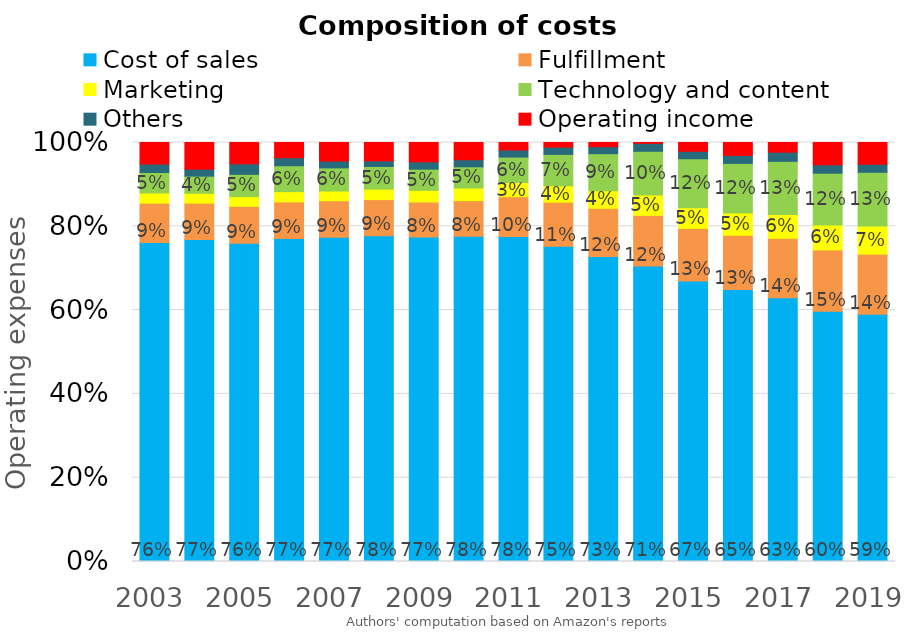
| Category | Cost of sales | Fulfillment | Marketing | Technology and content | Others | Operating income |
|---|---|---|---|---|---|---|
| 2003.0 | 0.761 | 0.094 | 0.024 | 0.049 | 0.02 | 0.051 |
| 2004.0 | 0.769 | 0.087 | 0.023 | 0.041 | 0.017 | 0.064 |
| 2005.0 | 0.76 | 0.088 | 0.023 | 0.053 | 0.025 | 0.051 |
| 2006.0 | 0.771 | 0.087 | 0.025 | 0.062 | 0.019 | 0.036 |
| 2007.0 | 0.774 | 0.087 | 0.023 | 0.055 | 0.016 | 0.044 |
| 2008.0 | 0.777 | 0.087 | 0.025 | 0.054 | 0.013 | 0.044 |
| 2009.0 | 0.774 | 0.084 | 0.028 | 0.051 | 0.018 | 0.046 |
| 2010.0 | 0.777 | 0.085 | 0.03 | 0.051 | 0.017 | 0.041 |
| 2011.0 | 0.776 | 0.095 | 0.034 | 0.061 | 0.017 | 0.018 |
| 2012.0 | 0.752 | 0.105 | 0.039 | 0.075 | 0.017 | 0.011 |
| 2013.0 | 0.728 | 0.115 | 0.042 | 0.088 | 0.017 | 0.01 |
| 2014.0 | 0.705 | 0.121 | 0.049 | 0.104 | 0.019 | 0.002 |
| 2015.0 | 0.67 | 0.125 | 0.049 | 0.117 | 0.018 | 0.021 |
| 2016.0 | 0.649 | 0.13 | 0.053 | 0.118 | 0.019 | 0.031 |
| 2017.0 | 0.629 | 0.142 | 0.057 | 0.127 | 0.022 | 0.023 |
| 2018.0 | 0.598 | 0.146 | 0.059 | 0.124 | 0.02 | 0.053 |
| 2019.0 | 0.59 | 0.143 | 0.067 | 0.128 | 0.019 | 0.052 |